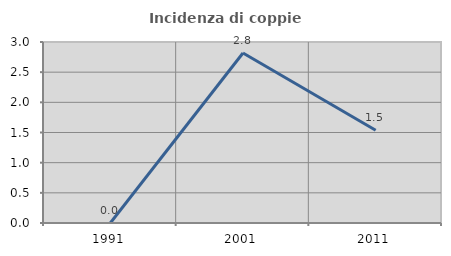
| Category | Incidenza di coppie miste |
|---|---|
| 1991.0 | 0 |
| 2001.0 | 2.817 |
| 2011.0 | 1.538 |